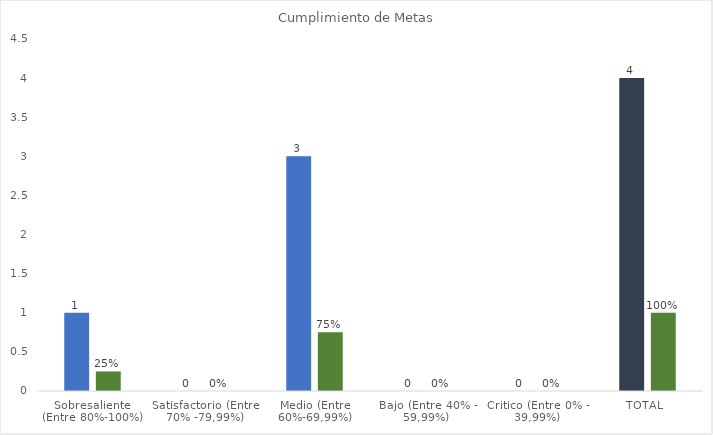
| Category | No. | % |
|---|---|---|
| Sobresaliente  (Entre 80%-100%)  | 1 | 0.25 |
| Satisfactorio (Entre 70% -79,99%) | 0 | 0 |
| Medio (Entre 60%-69,99%) | 3 | 0.75 |
| Bajo (Entre 40% - 59,99%) | 0 | 0 |
| Critico (Entre 0% - 39,99%) | 0 | 0 |
| TOTAL  | 4 | 1 |